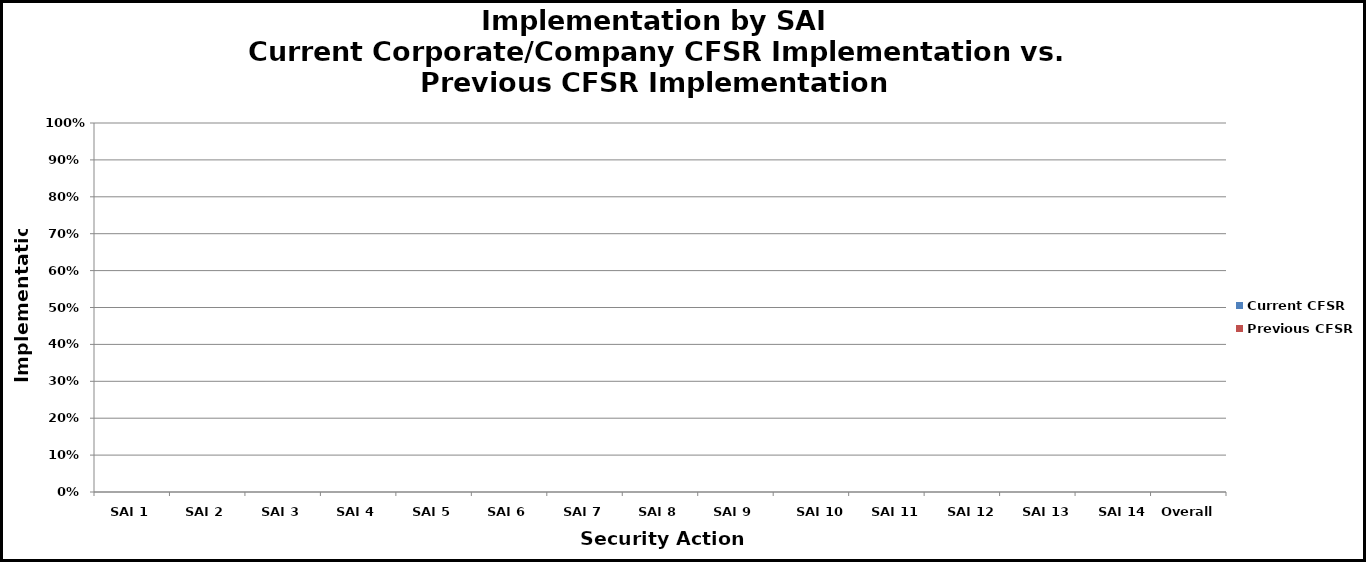
| Category | Current CFSR | Previous CFSR |
|---|---|---|
| SAI 1 | 0 | 0 |
| SAI 2 | 0 | 0 |
| SAI 3 | 0 | 0 |
| SAI 4 | 0 | 0 |
| SAI 5 | 0 | 0 |
| SAI 6 | 0 | 0 |
| SAI 7 | 0 | 0 |
| SAI 8 | 0 | 0 |
| SAI 9 | 0 | 0 |
| SAI 10 | 0 | 0 |
| SAI 11 | 0 | 0 |
| SAI 12 | 0 | 0 |
| SAI 13 | 0 | 0 |
| SAI 14 | 0 | 0 |
| Overall | 0 | 0 |